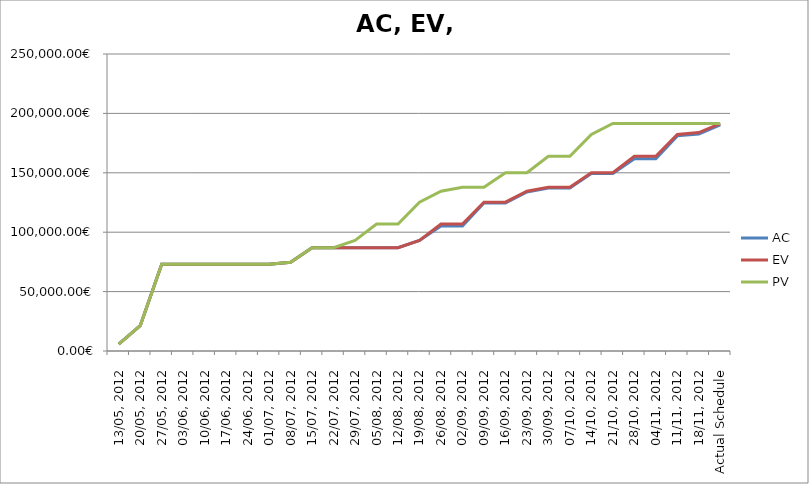
| Category | AC | EV | PV |
|---|---|---|---|
| 13/05, 2012 | 5771.7 | 5771.7 | 5771.7 |
| 20/05, 2012 | 21357 | 21357 | 21357 |
| 27/05, 2012 | 72986 | 72986 | 72986 |
| 03/06, 2012 | 72986 | 72986 | 72986 |
| 10/06, 2012 | 72986 | 72986 | 72986 |
| 17/06, 2012 | 72986 | 72986 | 72986 |
| 24/06, 2012 | 72986 | 72986 | 72986 |
| 01/07, 2012 | 72986 | 72986 | 72986 |
| 08/07, 2012 | 74707 | 74707 | 74707 |
| 15/07, 2012 | 86945 | 86945 | 86945 |
| 22/07, 2012 | 86945 | 86945 | 86945 |
| 29/07, 2012 | 86945 | 86945 | 93064 |
| 05/08, 2012 | 86945 | 86945 | 106915.099 |
| 12/08, 2012 | 86945 | 86945 | 106915.099 |
| 19/08, 2012 | 93064 | 93064 | 125272.099 |
| 26/08, 2012 | 105301.999 | 106915.099 | 134450.599 |
| 02/09, 2012 | 105301.999 | 106915.099 | 137868.099 |
| 09/09, 2012 | 124658.999 | 125272.099 | 137868.099 |
| 16/09, 2012 | 124658.999 | 125272.099 | 150106.099 |
| 23/09, 2012 | 133837.499 | 134450.599 | 150106.099 |
| 30/09, 2012 | 137254.999 | 137868.099 | 163957.199 |
| 07/10, 2012 | 137254.999 | 137868.099 | 163957.199 |
| 14/10, 2012 | 149492.999 | 150106.099 | 182314.199 |
| 21/10, 2012 | 149492.999 | 150106.099 | 191492.699 |
| 28/10, 2012 | 161730.999 | 163957.199 | 191492.699 |
| 04/11, 2012 | 161730.999 | 163957.199 | 191492.699 |
| 11/11, 2012 | 181087.999 | 182314.199 | 191492.699 |
| 18/11, 2012 | 182617.749 | 183843.949 | 191492.699 |
| Actual Schedule | 190266.499 | 191492.699 | 191492.699 |